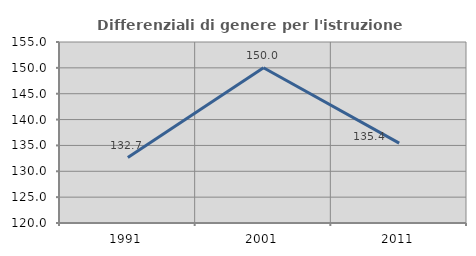
| Category | Differenziali di genere per l'istruzione superiore |
|---|---|
| 1991.0 | 132.654 |
| 2001.0 | 150.025 |
| 2011.0 | 135.436 |